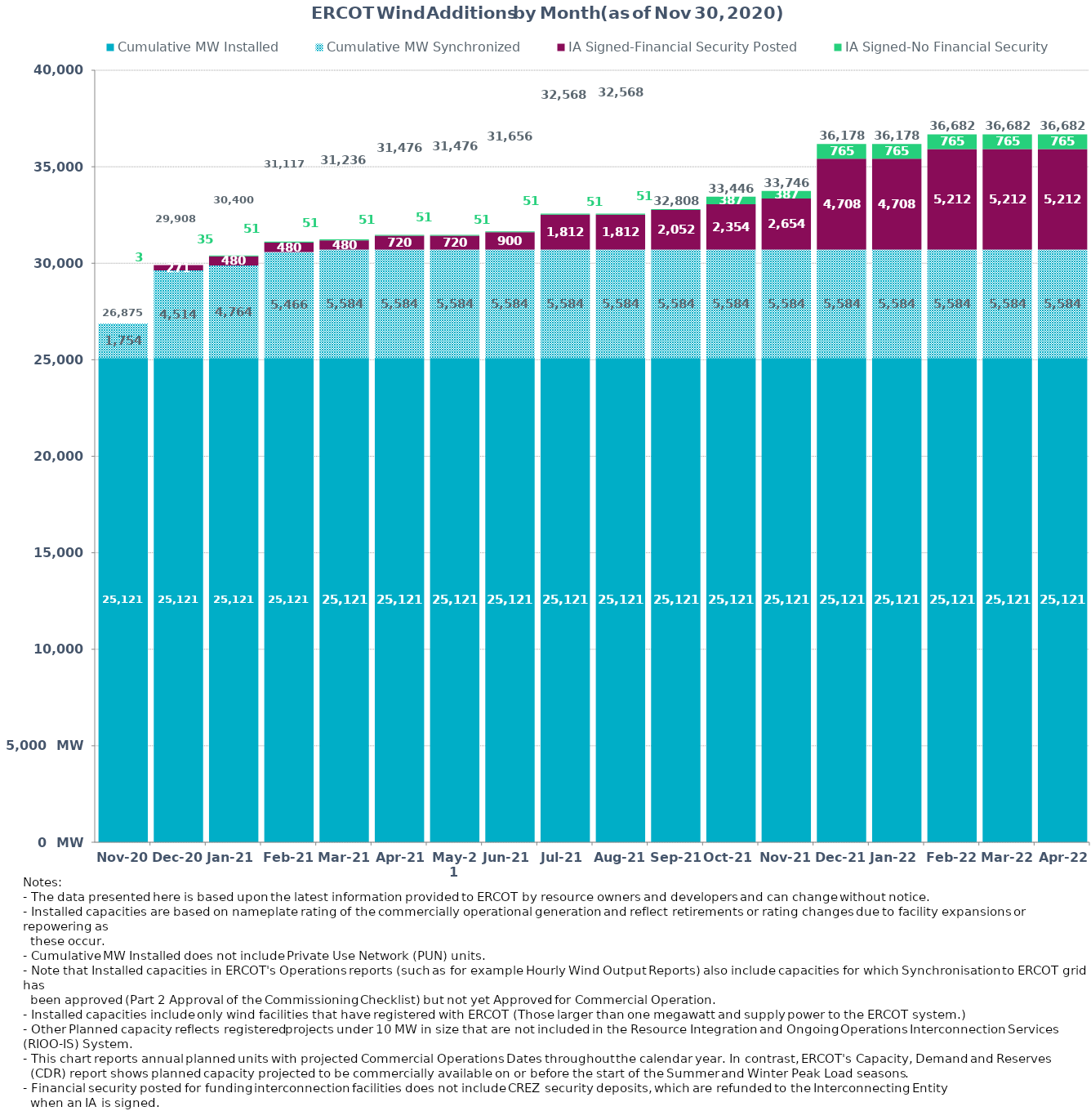
| Category | Cumulative MW Installed | Cumulative MW Synchronized | IA Signed-Financial Security Posted  | IA Signed-No Financial Security  | Other Planned | Cumulative Installed and Planned |
|---|---|---|---|---|---|---|
| 2020-11-20 | 25120.58 | 1754.4 | 0 | 0 | 0 | 26874.98 |
| 2020-12-20 | 25120.58 | 4513.81 | 270.8 | 3 | 0 | 29908.19 |
| 2021-01-20 | 25120.58 | 4763.93 | 480.2 | 35 | 0 | 30399.71 |
| 2021-02-20 | 25120.58 | 5465.63 | 480.2 | 50.96 | 0 | 31117.37 |
| 2021-03-20 | 25120.58 | 5584.43 | 480.2 | 50.96 | 0 | 31236.17 |
| 2021-04-20 | 25120.58 | 5584.43 | 720 | 50.96 | 0 | 31475.97 |
| 2021-05-20 | 25120.58 | 5584.43 | 720 | 50.96 | 0 | 31475.97 |
| 2021-06-20 | 25120.58 | 5584.43 | 900.08 | 50.96 | 0 | 31656.05 |
| 2021-07-20 | 25120.58 | 5584.43 | 1811.58 | 50.96 | 0 | 32567.55 |
| 2021-08-20 | 25120.58 | 5584.43 | 1811.58 | 50.96 | 0 | 32567.55 |
| 2021-09-20 | 25120.58 | 5584.43 | 2052.08 | 50.96 | 0 | 32808.05 |
| 2021-10-20 | 25120.58 | 5584.43 | 2354.08 | 386.96 | 0 | 33446.05 |
| 2021-11-20 | 25120.58 | 5584.43 | 2654.08 | 386.96 | 0 | 33746.05 |
| 2021-12-20 | 25120.58 | 5584.43 | 4707.8 | 765.16 | 0 | 36177.97 |
| 2022-01-20 | 25120.58 | 5584.43 | 4707.8 | 765.16 | 0 | 36177.97 |
| 2022-02-20 | 25120.58 | 5584.43 | 5211.8 | 765.16 | 0 | 36681.97 |
| 2022-03-20 | 25120.58 | 5584.43 | 5211.8 | 765.16 | 0 | 36681.97 |
| 2022-04-20 | 25120.58 | 5584.43 | 5211.8 | 765.16 | 0 | 36681.97 |